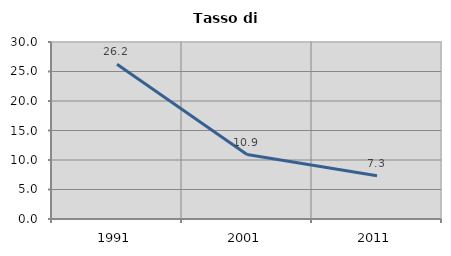
| Category | Tasso di disoccupazione   |
|---|---|
| 1991.0 | 26.22 |
| 2001.0 | 10.924 |
| 2011.0 | 7.317 |